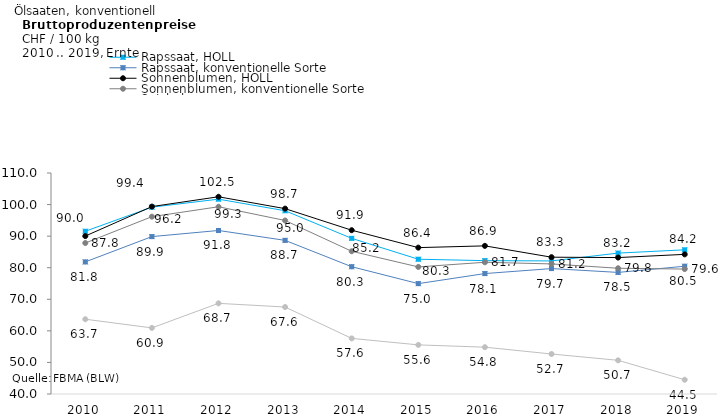
| Category | Rapssaat, HOLL | Rapssaat, konventionelle Sorte | Sonnenblumen, HOLL | Sonnenblumen, konventionelle Sorte | Sojabohnen |
|---|---|---|---|---|---|
| 2010.0 | 91.547 | 81.84 | 90.022 | 87.824 | 63.685 |
| 2011.0 | 99.18 | 89.854 | 99.367 | 96.165 | 60.937 |
| 2012.0 | 101.712 | 91.796 | 102.469 | 99.308 | 68.713 |
| 2013.0 | 98.04 | 88.661 | 98.71 | 94.96 | 67.55 |
| 2014.0 | 89.3 | 80.32 | 91.88 | 85.21 | 57.61 |
| 2015.0 | 82.688 | 74.959 | 86.368 | 80.251 | 55.555 |
| 2016.0 | 82.24 | 78.143 | 86.919 | 81.725 | 54.829 |
| 2017.0 | 82.155 | 79.731 | 83.334 | 81.197 | 52.67 |
| 2018.0 | 84.629 | 78.509 | 83.215 | 79.83 | 50.665 |
| 2019.0 | 85.673 | 80.468 | 84.225 | 79.569 | 44.515 |